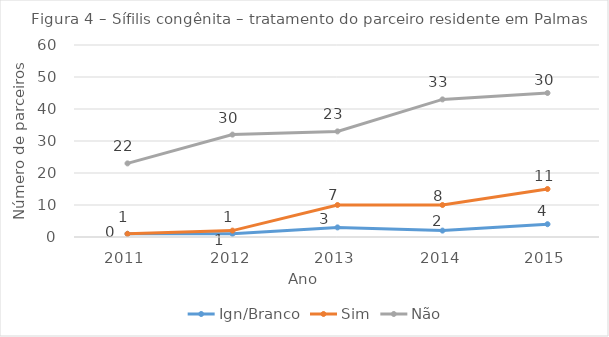
| Category | Ign/Branco | Sim | Não |
|---|---|---|---|
| 2011 | 1 | 0 | 22 |
| 2012 | 1 | 1 | 30 |
| 2013 | 3 | 7 | 23 |
| 2014 | 2 | 8 | 33 |
| 2015 | 4 | 11 | 30 |